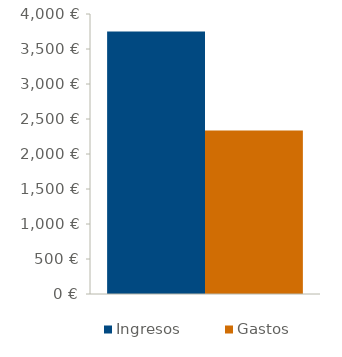
| Category | Ingresos | Gastos |
|---|---|---|
| 0 | 3750 | 2336 |